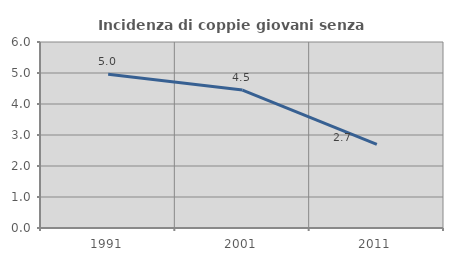
| Category | Incidenza di coppie giovani senza figli |
|---|---|
| 1991.0 | 4.963 |
| 2001.0 | 4.45 |
| 2011.0 | 2.698 |